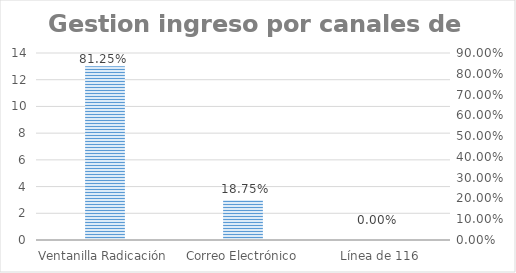
| Category | Series 0 |
|---|---|
| Ventanilla Radicación | 13 |
| Correo Electrónico | 3 |
| Línea de 116 | 0 |